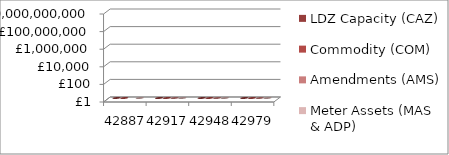
| Category | LDZ Capacity (CAZ) | Commodity (COM) | Amendments (AMS) | Meter Assets (MAS & ADP) |
|---|---|---|---|---|
| 42887.0 | 288773735.37 | 16487569.55 | -3258688.63 | 187370.3 |
| 42917.0 | 298593731.84 | 16897919.7 | 247176.37 | 193814.49 |
| 42948.0 | 298862406.46 | 16761360.58 | 1357290.74 | 193840.59 |
| 42979.0 | 289415948.74 | 20098400.73 | 205300.25 | 187587.95 |